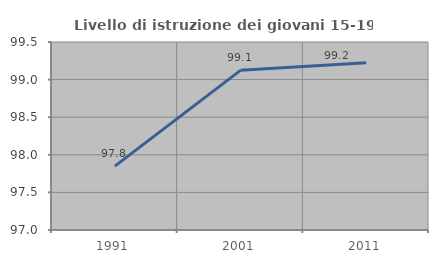
| Category | Livello di istruzione dei giovani 15-19 anni |
|---|---|
| 1991.0 | 97.849 |
| 2001.0 | 99.123 |
| 2011.0 | 99.225 |